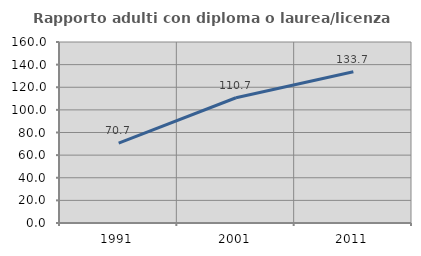
| Category | Rapporto adulti con diploma o laurea/licenza media  |
|---|---|
| 1991.0 | 70.659 |
| 2001.0 | 110.716 |
| 2011.0 | 133.692 |